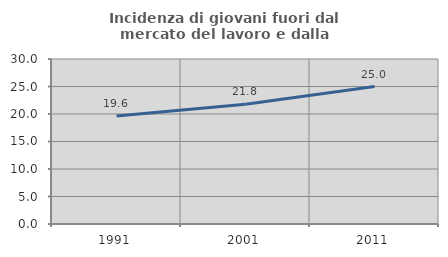
| Category | Incidenza di giovani fuori dal mercato del lavoro e dalla formazione  |
|---|---|
| 1991.0 | 19.626 |
| 2001.0 | 21.774 |
| 2011.0 | 25 |